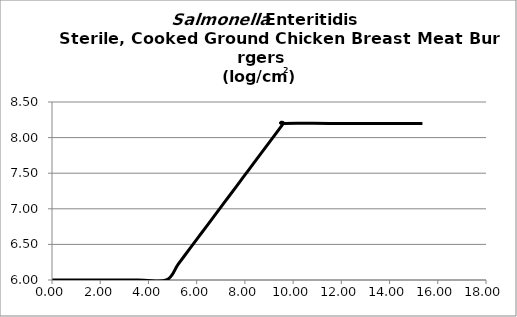
| Category | log/cm2 |
|---|---|
| 0.0 | 6 |
| 1.1858928541567384 | 6 |
| 3.5576785624702154 | 6 |
| 4.743571416626954 | 6 |
| 5.229413823789778 | 6.22 |
| 5.715256230952603 | 6.44 |
| 6.201098638115427 | 6.66 |
| 6.686941045278251 | 6.88 |
| 7.172783452441076 | 7.1 |
| 7.6586258596039 | 7.32 |
| 8.144468266766726 | 7.54 |
| 8.63031067392955 | 7.759 |
| 9.553411247538916 | 8.177 |
| 9.601995488255199 | 8.199 |
| 11.522394585906238 | 8.199 |
| 13.442793683557277 | 8.199 |
| 15.363192781208319 | 8.199 |